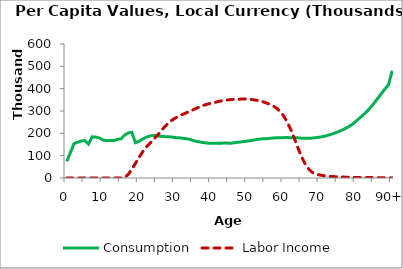
| Category | Consumption | Labor Income |
|---|---|---|
| 0 | 74158.321 | 0 |
|  | 114425.327 | 0 |
| 2 | 153885.883 | 0 |
| 3 | 160291.418 | 0 |
| 4 | 165668.209 | 0 |
| 5 | 167671.447 | 0 |
| 6 | 151770.037 | 0 |
| 7 | 184317.29 | 0 |
| 8 | 183097.51 | 0 |
| 9 | 179463.649 | 0 |
| 10 | 170007.244 | 0 |
| 11 | 167153.469 | 0 |
| 12 | 168271.691 | 0 |
| 13 | 167591.96 | 0 |
| 14 | 172626.218 | 0 |
| 15 | 175778.501 | 0 |
| 16 | 191662.642 | 2102.235 |
| 17 | 201819.903 | 16111.788 |
| 18 | 204410.772 | 39669.857 |
| 19 | 158115.122 | 65988.295 |
| 20 | 164860.37 | 92509.495 |
| 21 | 174288.551 | 117684.35 |
| 22 | 182857.376 | 138788.301 |
| 23 | 188390.218 | 155832.78 |
| 24 | 190447.341 | 172344.574 |
| 25 | 188796.742 | 190443.631 |
| 26 | 186778.306 | 209620.737 |
| 27 | 185312.092 | 228067.087 |
| 28 | 184737.096 | 244549.882 |
| 29 | 183648.625 | 258020.22 |
| 30 | 180945.755 | 268491.731 |
| 31 | 179864.208 | 276874.269 |
| 32 | 177990.94 | 284488.689 |
| 33 | 175915.401 | 291607.792 |
| 34 | 173377.948 | 298693.545 |
| 35 | 167176.618 | 306177.657 |
| 36 | 163801.536 | 313532.54 |
| 37 | 160703.488 | 320103.426 |
| 38 | 157994.574 | 326194.044 |
| 39 | 156147.524 | 331271.061 |
| 40 | 155660.328 | 334987.294 |
| 41 | 155562.079 | 338702.852 |
| 42 | 155662.841 | 342817.792 |
| 43 | 156083.881 | 346009.375 |
| 44 | 157011.89 | 348350.569 |
| 45 | 155193.781 | 350528.681 |
| 46 | 157116.955 | 351981.156 |
| 47 | 159182.843 | 352392.736 |
| 48 | 161360.536 | 353100.672 |
| 49 | 163496.33 | 353849.559 |
| 50 | 165484.228 | 353414.337 |
| 51 | 167952.875 | 351715.547 |
| 52 | 170660.671 | 349385.773 |
| 53 | 173198.9 | 346518.448 |
| 54 | 175393.881 | 342393.641 |
| 55 | 175604.655 | 337234.108 |
| 56 | 177357.864 | 331128.641 |
| 57 | 178904.275 | 323377.581 |
| 58 | 179989.613 | 312980.157 |
| 59 | 180753.144 | 298126.43 |
| 60 | 180767.375 | 277333.95 |
| 61 | 180855.218 | 249656.928 |
| 62 | 180645.812 | 215129.573 |
| 63 | 180292.769 | 174636.563 |
| 64 | 179690.369 | 132131.914 |
| 65 | 178196.907 | 92895.996 |
| 66 | 177710.206 | 61096.92 |
| 67 | 177720.45 | 38112.329 |
| 68 | 178842.661 | 23953.448 |
| 69 | 180758.603 | 17033.355 |
| 70 | 183249.66 | 13456.562 |
| 71 | 186390.947 | 10728.448 |
| 72 | 190240.224 | 8607.46 |
| 73 | 194870.625 | 7159.748 |
| 74 | 200324.073 | 6093.435 |
| 75 | 206588.885 | 5187.08 |
| 76 | 213503.685 | 4365.305 |
| 77 | 221143.438 | 3775.766 |
| 78 | 230191.137 | 3453.493 |
| 79 | 240934.475 | 3020.421 |
| 80 | 254197.321 | 2552.384 |
| 81 | 268218.002 | 2230.374 |
| 82 | 282732.908 | 2007.142 |
| 83 | 298482.888 | 1812.417 |
| 84 | 316170.303 | 1736.454 |
| 85 | 335678.471 | 1642.503 |
| 86 | 356435.028 | 1470.125 |
| 87 | 377609.417 | 1311.256 |
| 88 | 398367.597 | 1162.077 |
| 89 | 417975.667 | 994.847 |
| 90+ | 480542.726 | 343.01 |